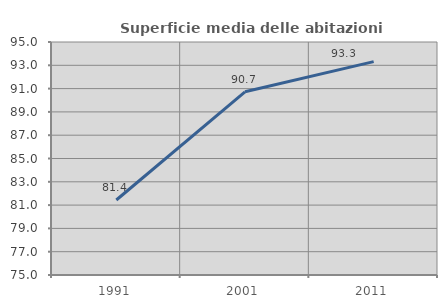
| Category | Superficie media delle abitazioni occupate |
|---|---|
| 1991.0 | 81.438 |
| 2001.0 | 90.725 |
| 2011.0 | 93.317 |